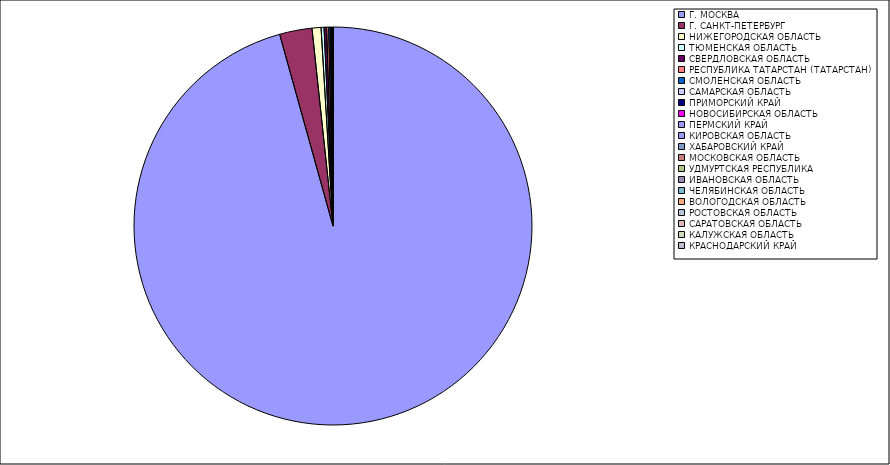
| Category | Оборот |
|---|---|
| Г. МОСКВА | 95.627 |
| Г. САНКТ-ПЕТЕРБУРГ | 2.633 |
| НИЖЕГОРОДСКАЯ ОБЛАСТЬ | 0.729 |
| ТЮМЕНСКАЯ ОБЛАСТЬ | 0.242 |
| СВЕРДЛОВСКАЯ ОБЛАСТЬ | 0.202 |
| РЕСПУБЛИКА ТАТАРСТАН (ТАТАРСТАН) | 0.169 |
| СМОЛЕНСКАЯ ОБЛАСТЬ | 0.132 |
| САМАРСКАЯ ОБЛАСТЬ | 0.054 |
| ПРИМОРСКИЙ КРАЙ | 0.039 |
| НОВОСИБИРСКАЯ ОБЛАСТЬ | 0.018 |
| ПЕРМСКИЙ КРАЙ | 0.015 |
| КИРОВСКАЯ ОБЛАСТЬ | 0.012 |
| ХАБАРОВСКИЙ КРАЙ | 0.011 |
| МОСКОВСКАЯ ОБЛАСТЬ | 0.01 |
| УДМУРТСКАЯ РЕСПУБЛИКА | 0.009 |
| ИВАНОВСКАЯ ОБЛАСТЬ | 0.009 |
| ЧЕЛЯБИНСКАЯ ОБЛАСТЬ | 0.007 |
| ВОЛОГОДСКАЯ ОБЛАСТЬ | 0.007 |
| РОСТОВСКАЯ ОБЛАСТЬ | 0.006 |
| САРАТОВСКАЯ ОБЛАСТЬ | 0.006 |
| КАЛУЖСКАЯ ОБЛАСТЬ | 0.005 |
| КРАСНОДАРСКИЙ КРАЙ | 0.005 |